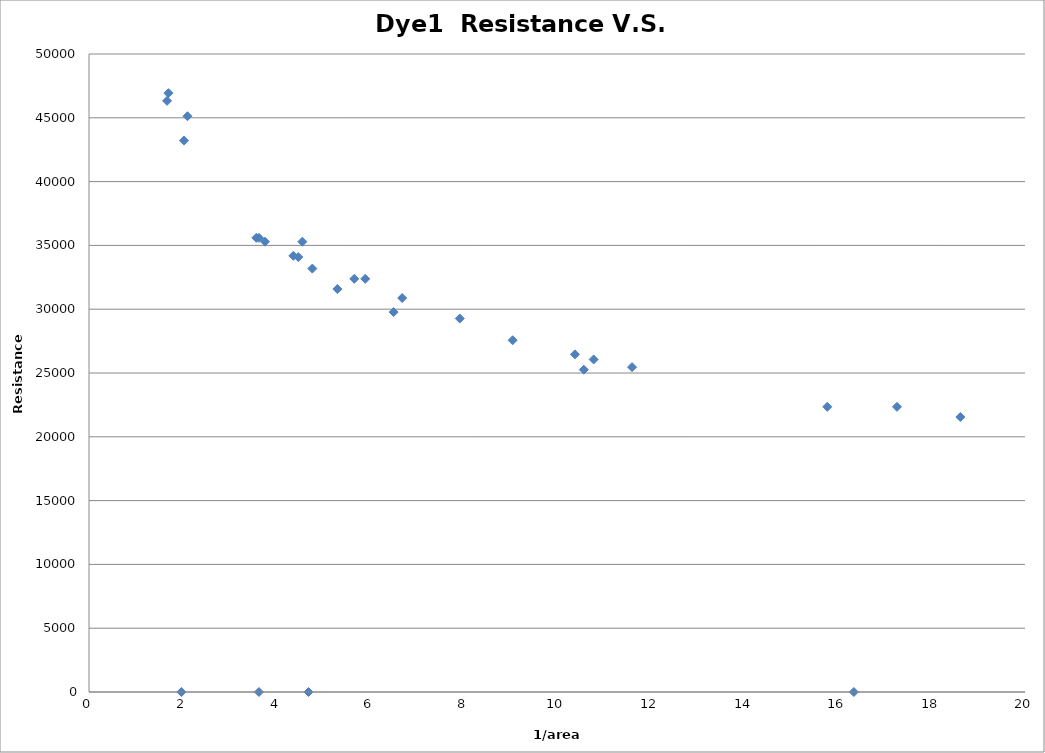
| Category | Series 0 |
|---|---|
| 1.6967999999999999 | 46930.928 |
| 2.0296 | 43217.304 |
| 1.6683999999999999 | 46328.68 |
| 1.9729 | 0 |
| 2.1037 | 45124.23 |
| 3.632 | 0 |
| 4.772200000000001 | 33183.297 |
| 3.7600000000000002 | 35290.098 |
| 3.632 | 35591.084 |
| 3.5752 | 35591.084 |
| 4.6903999999999995 | 0 |
| 6.5095 | 29772.67 |
| 4.558 | 35290.098 |
| 4.472 | 34086.189 |
| 4.368 | 34186.513 |
| 6.6926000000000005 | 30876.056 |
| 7.9222 | 29271.147 |
| 5.902 | 32380.754 |
| 5.668000000000001 | 32380.754 |
| 5.3072 | 31578.237 |
| 10.7835 | 26061.644 |
| 11.6046 | 25459.909 |
| 10.3834 | 26462.809 |
| 9.052 | 27566.046 |
| 10.573500000000001 | 25259.334 |
| 15.7752 | 22351.18 |
| 18.618599999999997 | 21548.991 |
| 16.3432 | 0 |
| 17.264 | 22351.18 |